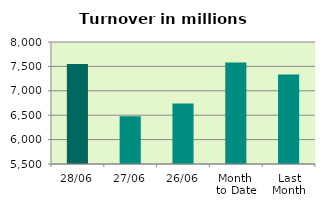
| Category | Series 0 |
|---|---|
| 28/06 | 7549.151 |
| 27/06 | 6479.151 |
| 26/06 | 6742.079 |
| Month 
to Date | 7579.876 |
| Last
Month | 7336.2 |